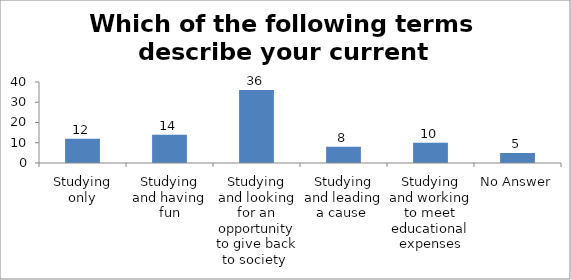
| Category | Which of the following terms describe your current situation? |
|---|---|
| Studying only | 12 |
| Studying and having fun | 14 |
| Studying and looking for an opportunity to give back to society  | 36 |
| Studying and leading a cause  | 8 |
| Studying and working to meet educational expenses | 10 |
| No Answer | 5 |